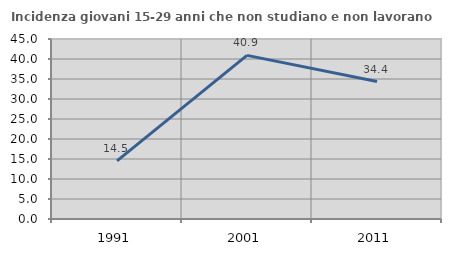
| Category | Incidenza giovani 15-29 anni che non studiano e non lavorano  |
|---|---|
| 1991.0 | 14.521 |
| 2001.0 | 40.909 |
| 2011.0 | 34.375 |